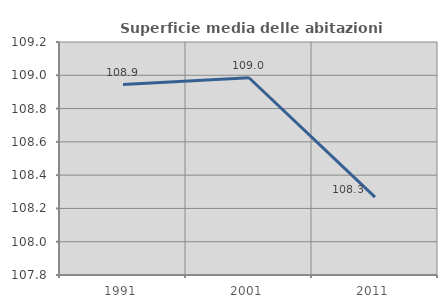
| Category | Superficie media delle abitazioni occupate |
|---|---|
| 1991.0 | 108.944 |
| 2001.0 | 108.985 |
| 2011.0 | 108.268 |